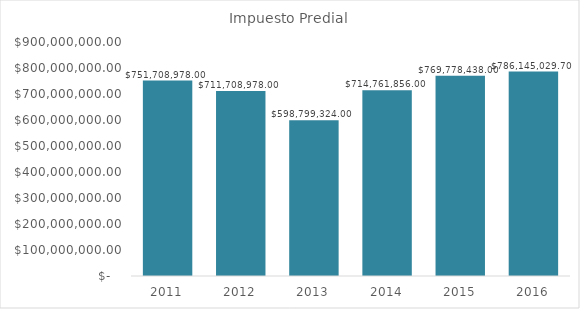
| Category | Impuesto Predial |
|---|---|
| 2011.0 | 751708978 |
| 2012.0 | 711708978 |
| 2013.0 | 598799324 |
| 2014.0 | 714761856 |
| 2015.0 | 769778438 |
| 2016.0 | 786145029.7 |